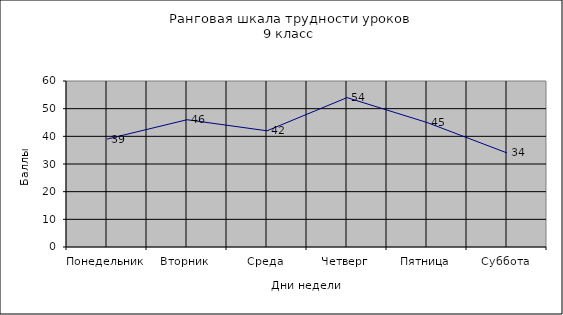
| Category | Series 0 |
|---|---|
| Понедельник | 39 |
| Вторник | 46 |
| Среда | 42 |
| Четверг | 54 |
| Пятница | 45 |
| Суббота | 34 |